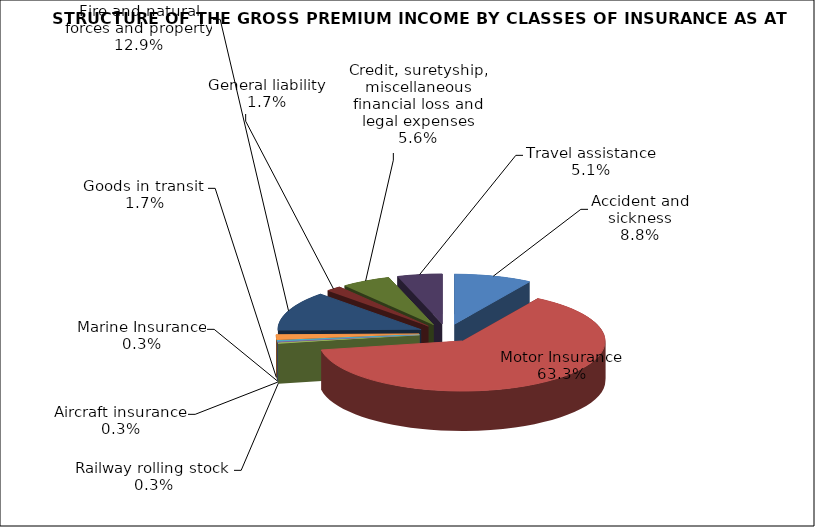
| Category | Accident and sickness |
|---|---|
| Accident and sickness | 0.088 |
| Motor Insurance | 0.633 |
| Railway rolling stock  | 0.003 |
| Aircraft insurance | 0.003 |
| Marine Insurance | 0.003 |
| Goods in transit  | 0.017 |
| Fire and natural forces and property | 0.129 |
| General liability | 0.017 |
| Credit, suretyship, miscellaneous financial loss and legal expenses | 0.056 |
| Travel assistance | 0.051 |